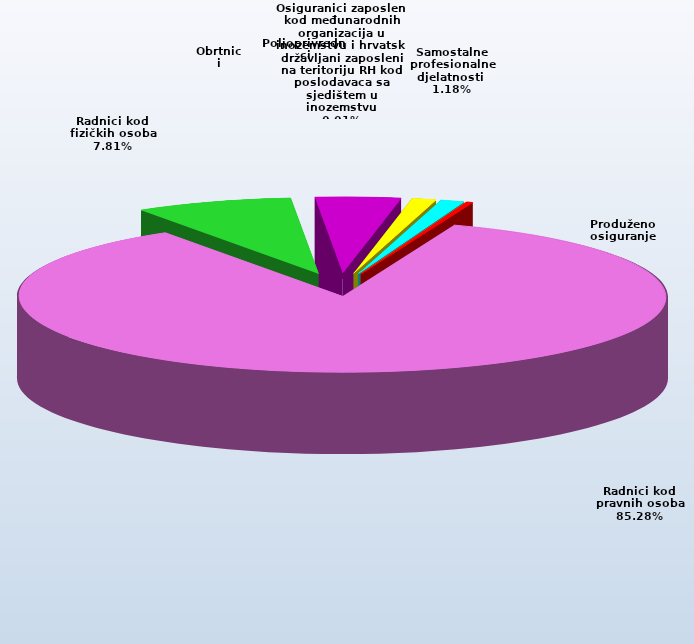
| Category | Series 0 |
|---|---|
| Radnici kod pravnih osoba | 1364748 |
| Radnici kod fizičkih osoba | 124928 |
| Obrtnici | 67769 |
| Poljoprivrednici | 19229 |
| Samostalne profesionalne djelatnosti  | 18925 |
| Osiguranici zaposleni kod međunarodnih organizacija u inozemstvu i hrvatski državljani zaposleni na teritoriju RH kod poslodavaca sa sjedištem u inozemstvu | 89 |
| Produženo osiguranje | 4717 |